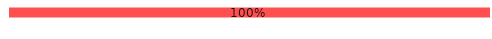
| Category | Oui | Non |
|---|---|---|
| Complétude N2 | 0 | 1 |